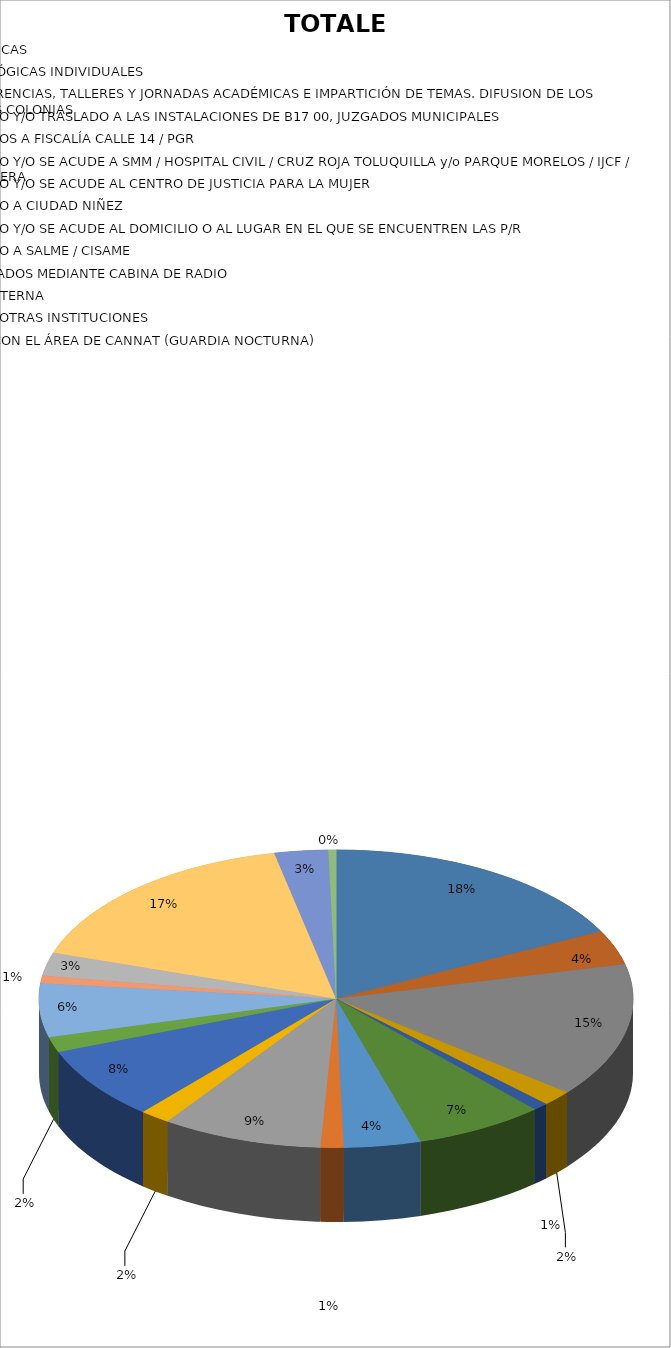
| Category | TOTALES |
|---|---|
| ASESORIAS JURÍDICAS | 42 |
| TERAPIAS PSICOLÓGICAS INDIVIDUALES | 9 |
| ACUDIR A CONFERENCIAS, TALLERES Y JORNADAS ACADÉMICAS E IMPARTICIÓN DE TEMAS. DIFUSION DE LOS SERVICIOS EN LAS COLONIAS | 35 |
| ACOMPAÑAMIENTO Y/O TRASLADO A LAS INSTALACIONES DE B17 00, JUZGADOS MUNICIPALES | 4 |
| ACOMPAÑAMIENTOS A FISCALÍA CALLE 14 / PGR | 2 |
| ACOMPAÑAMIENTO Y/O SE ACUDE A SMM / HOSPITAL CIVIL / CRUZ ROJA TOLUQUILLA y/o PARQUE MORELOS / IJCF / CENTRAL CAMIONERA | 17 |
| ACOMPAÑAMIENTO Y/O SE ACUDE AL CENTRO DE JUSTICIA PARA LA MUJER | 10 |
| ACOMPAÑAMIENTO A CIUDAD NIÑEZ  | 3 |
| ACOMPAÑAMIENTO Y/O SE ACUDE AL DOMICILIO O AL LUGAR EN EL QUE SE ENCUENTREN LAS P/R | 21 |
| ACOMPAÑAMIENTO A SALME / CISAME | 4 |
| SERVICIOS DERIVADOS MEDIANTE CABINA DE RADIO | 19 |
| CANALIZACIÓN INTERNA | 4 |
| CANALIZACIÓN A OTRAS INSTITUCIONES | 14 |
| COLABORACIÓN CON EL ÁREA DE CANNAT (GUARDIA NOCTURNA) | 2 |
| VISITAS DOMICILIARIAS  | 6 |
| VISITAS DOMICILIARIAS DE NOTIFICACIONES DE LAS ORDENES DE PROTECCIÓN A DENUNCIADOS | 40 |
| ATENCIONES Y AUXILIO PSICOLÓGICO | 7 |
| ENTREGA DE DISPOSITIVO "PULSO DE VIDA" | 1 |